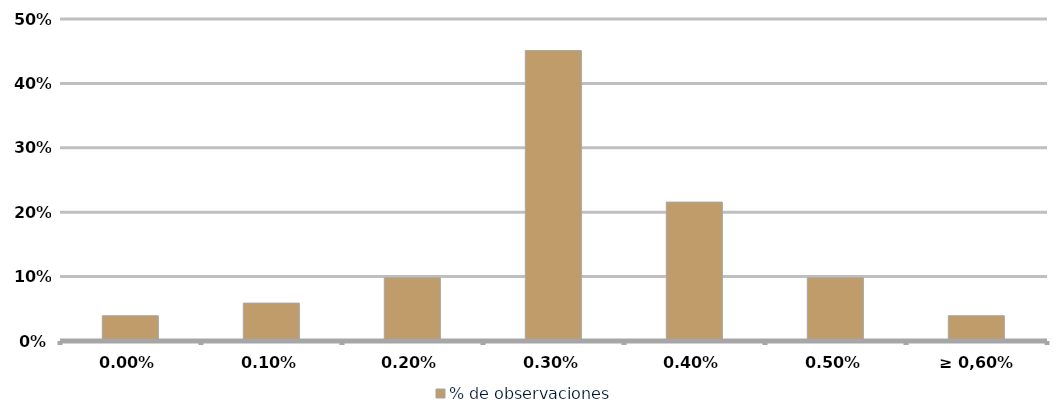
| Category | % de observaciones  |
|---|---|
| 0,00% | 0.039 |
| 0,10% | 0.059 |
| 0,20% | 0.098 |
| 0,30% | 0.451 |
| 0,40% | 0.216 |
| 0,50% | 0.098 |
| ≥ 0,60% | 0.039 |